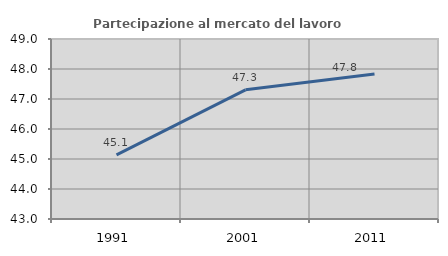
| Category | Partecipazione al mercato del lavoro  femminile |
|---|---|
| 1991.0 | 45.139 |
| 2001.0 | 47.306 |
| 2011.0 | 47.833 |